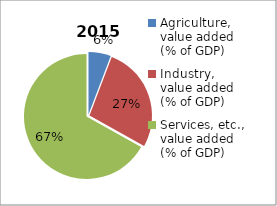
| Category | 2015 |
|---|---|
| Agriculture, value added (% of GDP)  | 5.787 |
| Industry, value added (% of GDP) | 27.303 |
| Services, etc., value added (% of GDP) | 66.91 |